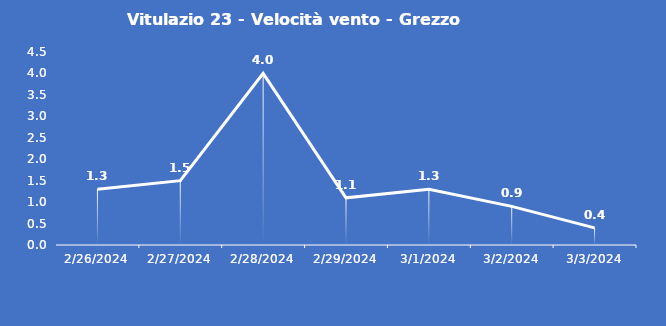
| Category | Vitulazio 23 - Velocità vento - Grezzo (m/s) |
|---|---|
| 2/26/24 | 1.3 |
| 2/27/24 | 1.5 |
| 2/28/24 | 4 |
| 2/29/24 | 1.1 |
| 3/1/24 | 1.3 |
| 3/2/24 | 0.9 |
| 3/3/24 | 0.4 |